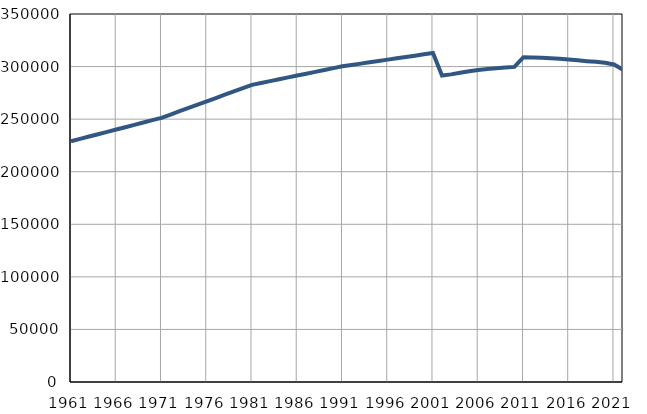
| Category | Број
становника |
|---|---|
| 1961.0 | 228991 |
| 1962.0 | 231215 |
| 1963.0 | 233439 |
| 1964.0 | 235663 |
| 1965.0 | 237887 |
| 1966.0 | 240111 |
| 1967.0 | 242334 |
| 1968.0 | 244558 |
| 1969.0 | 246782 |
| 1970.0 | 249006 |
| 1971.0 | 251230 |
| 1972.0 | 254371 |
| 1973.0 | 257513 |
| 1974.0 | 260654 |
| 1975.0 | 263796 |
| 1976.0 | 266937 |
| 1977.0 | 270078 |
| 1978.0 | 273220 |
| 1979.0 | 276361 |
| 1980.0 | 279503 |
| 1981.0 | 282644 |
| 1982.0 | 284407 |
| 1983.0 | 286170 |
| 1984.0 | 287933 |
| 1985.0 | 289696 |
| 1986.0 | 291459 |
| 1987.0 | 293222 |
| 1988.0 | 294985 |
| 1989.0 | 296748 |
| 1990.0 | 298511 |
| 1991.0 | 300274 |
| 1992.0 | 301537 |
| 1993.0 | 302800 |
| 1994.0 | 304063 |
| 1995.0 | 305326 |
| 1996.0 | 306589 |
| 1997.0 | 307852 |
| 1998.0 | 309115 |
| 1999.0 | 310378 |
| 2000.0 | 311641 |
| 2001.0 | 312904 |
| 2002.0 | 291547 |
| 2003.0 | 292577 |
| 2004.0 | 294116 |
| 2005.0 | 295575 |
| 2006.0 | 296761 |
| 2007.0 | 297713 |
| 2008.0 | 298444 |
| 2009.0 | 299155 |
| 2010.0 | 299689 |
| 2011.0 | 308927 |
| 2012.0 | 308717 |
| 2013.0 | 308386 |
| 2014.0 | 308003 |
| 2015.0 | 307408 |
| 2016.0 | 306725 |
| 2017.0 | 305954 |
| 2018.0 | 305147 |
| 2019.0 | 304478 |
| 2020.0 | 303552 |
| 2021.0 | 302042 |
| 2022.0 | 297022 |